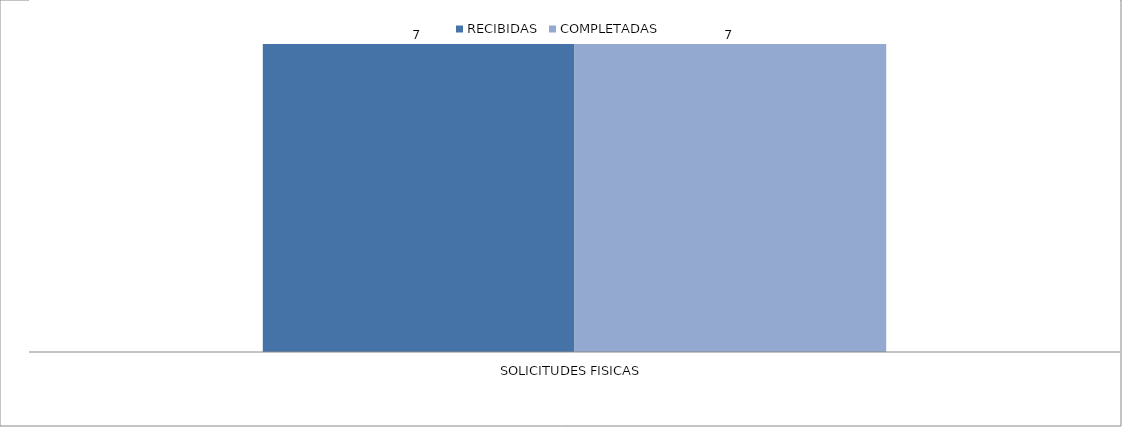
| Category | RECIBIDAS | COMPLETADAS |
|---|---|---|
| SOLICITUDES FISICAS | 7 | 7 |